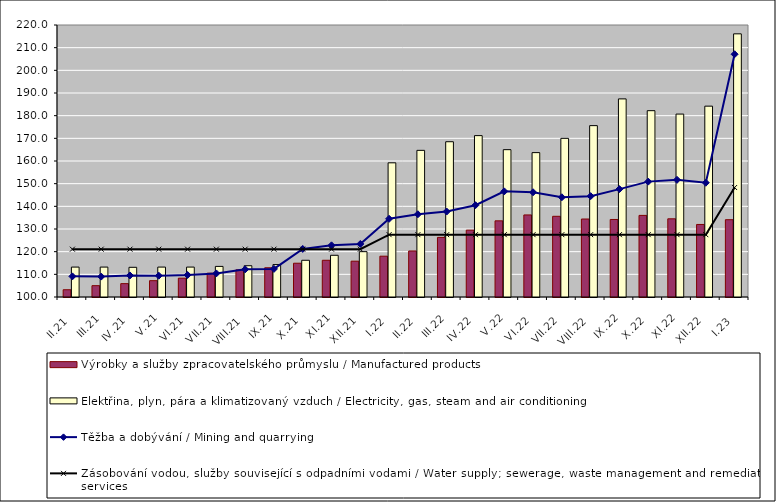
| Category | Výrobky a služby zpracovatelského průmyslu / Manufactured products | Elektřina, plyn, pára a klimatizovaný vzduch / Electricity, gas, steam and air conditioning |
|---|---|---|
| II.21 | 103.2 | 113.2 |
| III.21 | 105 | 113.2 |
| IV.21 | 105.9 | 113.1 |
| V.21 | 107.2 | 113.2 |
| VI.21 | 108.3 | 113.2 |
| VII.21 | 110.5 | 113.5 |
| VIII.21 | 112 | 113.8 |
| IX.21 | 112.9 | 114.3 |
| X.21 | 114.9 | 116.2 |
| XI.21 | 116.2 | 118.4 |
| XII.21 | 115.8 | 120 |
| I.22 | 118 | 159.2 |
| II.22 | 120.3 | 164.7 |
| III.22 | 126.3 | 168.5 |
| IV.22 | 129.5 | 171.2 |
| V.22 | 133.6 | 165 |
| VI.22 | 136.2 | 163.7 |
| VII.22 | 135.6 | 170 |
| VIII.22 | 134.4 | 175.6 |
| IX.22 | 134.2 | 187.4 |
| X.22 | 136 | 182.2 |
| XI.22 | 134.5 | 180.7 |
| XII.22 | 132 | 184.2 |
| I.23 | 134.1 | 216.1 |